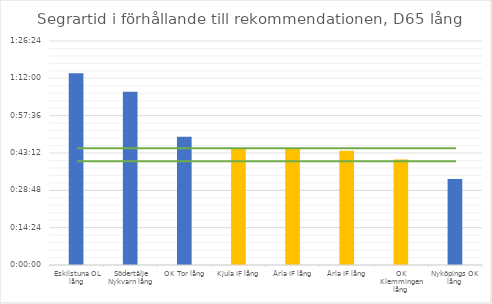
| Category | D65 tid |
|---|---|
| Eskilstuna OL lång | 0.051 |
| Södertälje Nykvarn lång | 0.046 |
| OK Tor lång | 0.034 |
| Kjula IF lång | 0.031 |
| Ärla IF lång | 0.031 |
| Ärla IF lång | 0.031 |
| OK Klemmingen lång | 0.028 |
| Nyköpings OK lång | 0.023 |